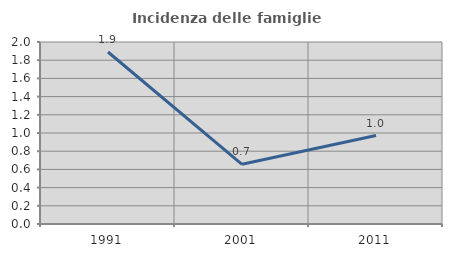
| Category | Incidenza delle famiglie numerose |
|---|---|
| 1991.0 | 1.89 |
| 2001.0 | 0.656 |
| 2011.0 | 0.972 |